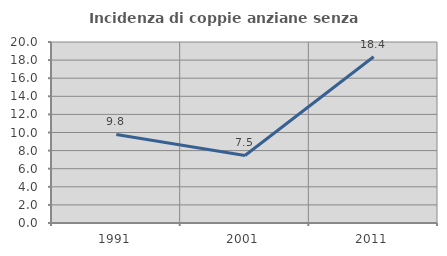
| Category | Incidenza di coppie anziane senza figli  |
|---|---|
| 1991.0 | 9.783 |
| 2001.0 | 7.463 |
| 2011.0 | 18.367 |